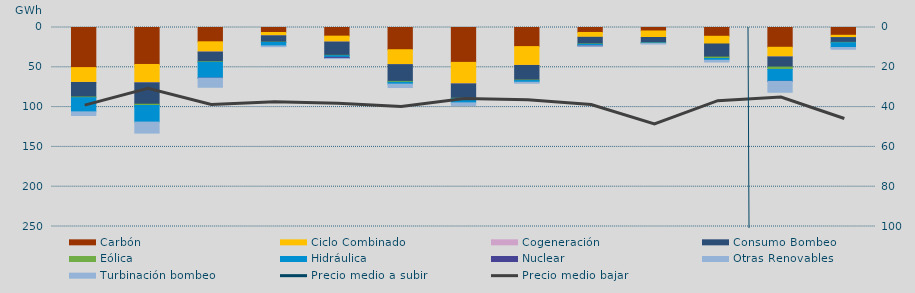
| Category | Carbón | Ciclo Combinado | Cogeneración | Consumo Bombeo | Eólica | Hidráulica | Nuclear | Otras Renovables | Turbinación bombeo |
|---|---|---|---|---|---|---|---|---|---|
| 0 | 50376 | 18600.8 | 92.8 | 18257.2 | 867.9 | 17793.5 | 0 | 0 | 4596.7 |
| 1 | 46429 | 22875.8 | 230 | 26858.5 | 1566 | 20878.9 | 0 | 0 | 13810.2 |
| 2 | 17956.2 | 12815.5 | 103.4 | 12162.2 | 688.3 | 19850.2 | 66 | 0 | 11430.1 |
| 3 | 6283.8 | 4145.3 | 18.9 | 7977.8 | 313 | 4389.8 | 0 | 0 | 935.6 |
| 4 | 10864.5 | 7378.2 | 88.1 | 16621.4 | 464.4 | 2067.3 | 1381.8 | 0 | 160.4 |
| 5 | 27924.7 | 18737.8 | 26.5 | 21039.7 | 1083.3 | 2318.1 | 0 | 0 | 4314 |
| 6 | 43819.1 | 26947.4 | 131.4 | 18038.2 | 700.3 | 5037 | 0 | 0 | 3400 |
| 7 | 23995.8 | 23603.4 | 120.4 | 18312.9 | 630.7 | 2095.3 | 0 | 0 | 1288.4 |
| 8 | 6238.1 | 6107.2 | 11.4 | 8233.1 | 466.1 | 1774.5 | 300.5 | 0 | 185 |
| 9 | 4345.4 | 8205.3 | 0 | 6736.7 | 204.5 | 506 | 0 | 0 | 802.1 |
| 10 | 11031.5 | 9660.7 | 0 | 16502.5 | 1775.9 | 2151.2 | 0 | 0 | 2234.6 |
| 11 | 24843.5 | 12025 | 139.2 | 12696.1 | 3036.8 | 14862.1 | 109.8 | 0 | 13649 |
| 12 | 9788.3 | 2896.9 | 13 | 5978.6 | 470.2 | 6144.5 | 0 | 2 | 2006.5 |